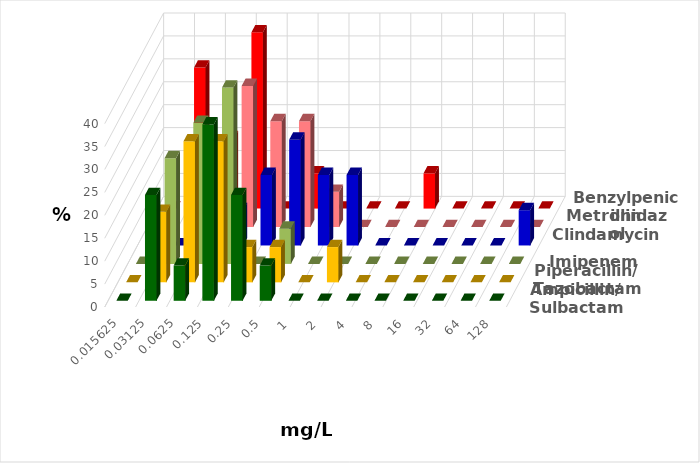
| Category | Ampicillin/ Sulbactam | Piperacillin/ Tazobactam | Imipenem | Clindamycin | Metronidazol | Benzylpenicillin |
|---|---|---|---|---|---|---|
| 0.015625 | 0 | 0 | 0 | 0 | 0 | 0 |
| 0.03125 | 23.077 | 15.385 | 23.077 | 0 | 7.692 | 30.769 |
| 0.0625 | 7.692 | 30.769 | 30.769 | 15.385 | 7.692 | 15.385 |
| 0.125 | 38.462 | 30.769 | 38.462 | 7.692 | 30.769 | 38.462 |
| 0.25 | 23.077 | 7.692 | 0 | 15.385 | 23.077 | 0 |
| 0.5 | 7.692 | 7.692 | 7.692 | 23.077 | 23.077 | 7.692 |
| 1.0 | 0 | 0 | 0 | 15.385 | 7.692 | 0 |
| 2.0 | 0 | 7.692 | 0 | 15.385 | 0 | 0 |
| 4.0 | 0 | 0 | 0 | 0 | 0 | 0 |
| 8.0 | 0 | 0 | 0 | 0 | 0 | 7.692 |
| 16.0 | 0 | 0 | 0 | 0 | 0 | 0 |
| 32.0 | 0 | 0 | 0 | 0 | 0 | 0 |
| 64.0 | 0 | 0 | 0 | 0 | 0 | 0 |
| 128.0 | 0 | 0 | 0 | 7.692 | 0 | 0 |